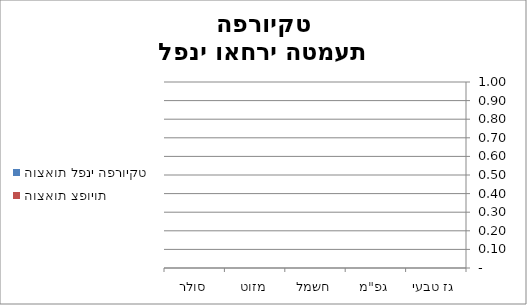
| Category | הוצאות לפני הפרויקט | הוצאות צפויות |
|---|---|---|
| גז טבעי | 0 | 0 |
| גפ"מ | 0 | 0 |
| חשמל | 0 | 0 |
| מזוט | 0 | 0 |
| סולר | 0 | 0 |